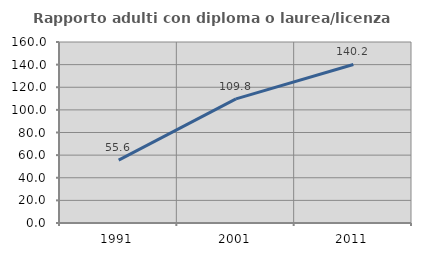
| Category | Rapporto adulti con diploma o laurea/licenza media  |
|---|---|
| 1991.0 | 55.579 |
| 2001.0 | 109.767 |
| 2011.0 | 140.167 |